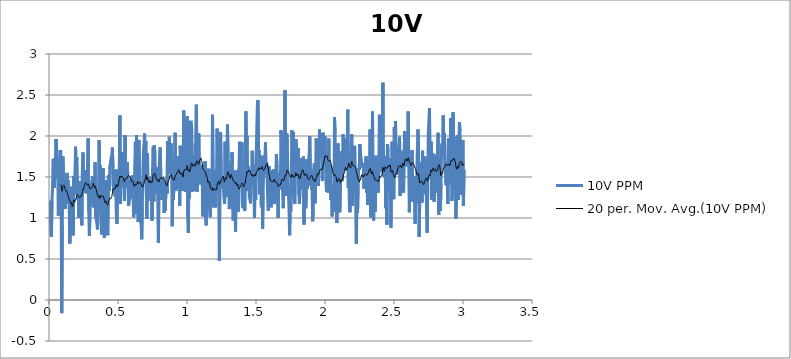
| Category | 10V PPM |
|---|---|
| 0.0048433325833333336 | 1.21 |
| 0.009013015527777779 | 1.17 |
| 0.013182420666666667 | 0.81 |
| 0.017351825805555558 | 0.77 |
| 0.021520675361111113 | 1.21 |
| 0.025689802694444444 | 1.36 |
| 0.029858652250000003 | 1.72 |
| 0.034027779611111114 | 1.64 |
| 0.03819690697222222 | 1.37 |
| 0.04236631211111111 | 1.73 |
| 0.046535161666666665 | 1.48 |
| 0.05070401122222222 | 1.96 |
| 0.054873416361111114 | 1.84 |
| 0.0590428215 | 1.82 |
| 0.06321167105555556 | 1.61 |
| 0.06738135399999999 | 1.03 |
| 0.07155020355555557 | 1.17 |
| 0.07571933088888888 | 1.18 |
| 0.07988845825 | 1.17 |
| 0.08405758558333333 | 1.83 |
| 0.08822671294444444 | 1.09 |
| 0.0923955625 | -0.16 |
| 0.09656468986111111 | 0.91 |
| 0.10073381719444445 | 1.75 |
| 0.10490322233333334 | 1.49 |
| 0.10907207188888889 | 1.35 |
| 0.11324092144444445 | 1.28 |
| 0.117409771 | 1.11 |
| 0.12158000952777778 | 1.1 |
| 0.1257491368888889 | 1.4 |
| 0.12991826422222222 | 1.55 |
| 0.13408711377777777 | 1.41 |
| 0.1382562411388889 | 1.46 |
| 0.14242509069444445 | 1.17 |
| 0.14659449583333334 | 1.23 |
| 0.1507633453888889 | 0.69 |
| 0.15493275052777777 | 0.87 |
| 0.15910187788888888 | 0.83 |
| 0.16327128302777777 | 1.38 |
| 0.16744041038888888 | 0.85 |
| 0.17160925994444445 | 1.19 |
| 0.17577838727777778 | 0.79 |
| 0.17994723683333333 | 1.51 |
| 0.18411636419444447 | 1.29 |
| 0.1882854915277778 | 1.53 |
| 0.19245517447222224 | 1.87 |
| 0.1966245796111111 | 1.55 |
| 0.2007937069722222 | 1.74 |
| 0.20496255652777778 | 1.43 |
| 0.20913223944444445 | 1.22 |
| 0.2133016446111111 | 1.41 |
| 0.21747077194444445 | 1 |
| 0.22163989930555553 | 1.45 |
| 0.22580902663888888 | 1.24 |
| 0.22998037633333335 | 1.36 |
| 0.2341497815 | 1.06 |
| 0.23831890883333331 | 0.91 |
| 0.24248803619444442 | 1.63 |
| 0.24665688575 | 1.8 |
| 0.2508257353055556 | 1.31 |
| 0.25499458486111115 | 1.44 |
| 0.25916399 | 1.58 |
| 0.26333422852777777 | 1.56 |
| 0.26750307808333335 | 1.51 |
| 0.2716724832222222 | 1.3 |
| 0.27584161058333334 | 1.57 |
| 0.2800115713888889 | 1.55 |
| 0.28418042083333334 | 1.97 |
| 0.2883498261111111 | 1.07 |
| 0.29251895333333333 | 0.78 |
| 0.296687525 | 1.06 |
| 0.30085693027777777 | 1.18 |
| 0.3050260575 | 1.3 |
| 0.309195185 | 1.44 |
| 0.31336403444444444 | 1.45 |
| 0.31753288416666664 | 1.51 |
| 0.32170228916666666 | 1.5 |
| 0.32587197222222225 | 1.13 |
| 0.33004109944444443 | 1.23 |
| 0.33421022694444447 | 1.68 |
| 0.33837935416666665 | 1.02 |
| 0.3425482038888889 | 1.02 |
| 0.3467173311111111 | 0.94 |
| 0.3508872919444444 | 0.86 |
| 0.3550561413888889 | 1.05 |
| 0.3592252686111111 | 1.34 |
| 0.36339439611111113 | 1.95 |
| 0.3675635233333333 | 1.19 |
| 0.37173237305555556 | 1.64 |
| 0.37590122249999997 | 1.07 |
| 0.3800700722222222 | 0.8 |
| 0.3842391994444444 | 1 |
| 0.3884080488888889 | 1.37 |
| 0.3925771763888889 | 1.61 |
| 0.39674797055555555 | 1.1 |
| 0.4009179311111111 | 0.76 |
| 0.4050867808333334 | 1 |
| 0.40925590805555556 | 1.46 |
| 0.4134258688888889 | 1.28 |
| 0.41759499611111106 | 1.05 |
| 0.4217641236111111 | 0.85 |
| 0.42593408416666667 | 0.79 |
| 0.43010348944444443 | 1.52 |
| 0.43427261666666667 | 1.5 |
| 0.43844174416666665 | 1.33 |
| 0.44261087138888894 | 1.64 |
| 0.4467797211111111 | 1.65 |
| 0.4509488483333334 | 1.74 |
| 0.45511825361111113 | 1.76 |
| 0.4592871030555556 | 1.86 |
| 0.46345623027777777 | 1.61 |
| 0.46762508 | 1.31 |
| 0.4717942072222222 | 1.3 |
| 0.4759633347222222 | 1.55 |
| 0.4801324619444445 | 1.26 |
| 0.4843015894444444 | 1.59 |
| 0.4884704388888889 | 1.05 |
| 0.4926406775 | 0.93 |
| 0.49680924916666663 | 1.38 |
| 0.5009805988888889 | 1.38 |
| 0.5051502819444444 | 1.58 |
| 0.5093210758333333 | 1.52 |
| 0.5134904811111111 | 2.25 |
| 0.5176596083333334 | 1.17 |
| 0.5218292913888889 | 1.63 |
| 0.5259998077777778 | 1.5 |
| 0.5301706019444444 | 1.8 |
| 0.5343419513888888 | 1.38 |
| 0.5385110788888888 | 1.63 |
| 0.5426804838888889 | 1.41 |
| 0.5468512780555556 | 1.21 |
| 0.5510229055555556 | 2.01 |
| 0.5551917552777778 | 1.37 |
| 0.5593608825 | 1.42 |
| 0.5635316766666667 | 1.51 |
| 0.5677024708333334 | 1.68 |
| 0.5718727091666667 | 1.45 |
| 0.5760421144444444 | 1.15 |
| 0.5802109638888889 | 1.19 |
| 0.584379813611111 | 1.23 |
| 0.5885486630555556 | 1.46 |
| 0.5927177905555556 | 1.24 |
| 0.5968880288888888 | 1.51 |
| 0.6010574341666667 | 1.35 |
| 0.6052273947222222 | 1.52 |
| 0.6093990222222222 | 1.28 |
| 0.6135695386111112 | 1.01 |
| 0.6177386661111112 | 1.14 |
| 0.6219080711111111 | 1.65 |
| 0.6260788652777778 | 1.93 |
| 0.6302479925 | 1.05 |
| 0.6344182311111111 | 2.01 |
| 0.6385898586111111 | 1.67 |
| 0.6427592636111111 | 1.88 |
| 0.6469283911111111 | 0.95 |
| 0.6510994630555555 | 1.95 |
| 0.6552694236111111 | 1.48 |
| 0.6594410511111111 | 1.16 |
| 0.6636099008333334 | 1.2 |
| 0.6677798613888889 | 0.92 |
| 0.6719495444444444 | 0.74 |
| 0.6761189494444444 | 1.16 |
| 0.6802886324999999 | 1.55 |
| 0.6844585933333334 | 1.82 |
| 0.6886279983333333 | 1.91 |
| 0.6927976813888889 | 2.03 |
| 0.6969665308333333 | 1.53 |
| 0.7011356583333334 | 1.94 |
| 0.7053042300000001 | 1.3 |
| 0.7094733572222222 | 0.99 |
| 0.7136424847222221 | 1.79 |
| 0.7178130011111111 | 1.21 |
| 0.7219821283333334 | 1.49 |
| 0.7261554225 | 1.5 |
| 0.7303267722222222 | 1.49 |
| 0.7344958997222222 | 1.49 |
| 0.7386650269444445 | 1.39 |
| 0.7428341544444444 | 1.46 |
| 0.7470032816666666 | 0.97 |
| 0.7511724091666666 | 1.61 |
| 0.7553432030555555 | 1.87 |
| 0.7595120527777778 | 1.2 |
| 0.7636809022222222 | 1.89 |
| 0.7678497519444444 | 1.74 |
| 0.7720199902777778 | 1.48 |
| 0.7761918955555556 | 1.3 |
| 0.7803615786111111 | 1.35 |
| 0.7845304280555556 | 1.51 |
| 0.7887001111111112 | 1.62 |
| 0.7928703497222223 | 0.7 |
| 0.7970408658333332 | 1.5 |
| 0.8012158269444444 | 1.75 |
| 0.8053852319444443 | 1.86 |
| 0.8095540816666666 | 1.58 |
| 0.8137232088888889 | 1.59 |
| 0.8178959477777777 | 1.22 |
| 0.8220659083333333 | 1.47 |
| 0.8262361469444444 | 1.36 |
| 0.8304055519444445 | 1.34 |
| 0.8345746794444445 | 1.06 |
| 0.8387435288888889 | 1.46 |
| 0.8429129341666667 | 1.09 |
| 0.8470828947222222 | 1.36 |
| 0.8512523 | 1.48 |
| 0.8554214272222223 | 1.3 |
| 0.8595905547222222 | 1.94 |
| 0.86376496 | 1.71 |
| 0.8679346430555556 | 1.8 |
| 0.872105715 | 1.99 |
| 0.8762767869444444 | 1.54 |
| 0.880445636388889 | 1.59 |
| 0.8846150416666666 | 1.91 |
| 0.8887841688888889 | 1.58 |
| 0.8929535741666667 | 0.9 |
| 0.8971238125 | 1.38 |
| 0.9012946066666667 | 1.22 |
| 0.9054634561111111 | 1.22 |
| 0.9096323058333333 | 1.64 |
| 0.9138017108333333 | 2.04 |
| 0.9179719494444444 | 1.33 |
| 0.9221424658333334 | 1.58 |
| 0.9263115930555555 | 1.56 |
| 0.9304809983333333 | 1.36 |
| 0.934650681111111 | 1.75 |
| 0.9388239755555556 | 1.71 |
| 0.9429936583333333 | 1.65 |
| 0.9471627858333332 | 1.15 |
| 0.9513344133333334 | 1.88 |
| 0.9555077074999999 | 1.66 |
| 0.9596910022222223 | 1.87 |
| 0.9638612408333334 | 1.45 |
| 0.9680303680555555 | 1.33 |
| 0.9722019955555556 | 1.37 |
| 0.9763708452777777 | 2.31 |
| 0.980542195 | 1.46 |
| 0.9847113222222222 | 1.52 |
| 0.9888807275 | 1.32 |
| 0.9930501325000001 | 1.47 |
| 0.9972189822222222 | 2.12 |
| 1.0013892205555555 | 2.24 |
| 1.0055602925 | 1.01 |
| 1.00972942 | 0.82 |
| 1.0138996583333333 | 1.66 |
| 1.0180693413888888 | 1.24 |
| 1.022238468611111 | 2.17 |
| 1.0264095405555556 | 2.16 |
| 1.0305783902777779 | 2.17 |
| 1.0347475175 | 2.08 |
| 1.0389169227777777 | 1.32 |
| 1.0430888280555555 | 1.38 |
| 1.0472590663888888 | 1.76 |
| 1.0514284716666666 | 1.33 |
| 1.0555981544444444 | 1.48 |
| 1.0597670041666667 | 1.91 |
| 1.0639361313888889 | 1.8 |
| 1.0681055366666667 | 2.38 |
| 1.072274663888889 | 1.32 |
| 1.0764449025 | 1.56 |
| 1.0806143075 | 1.46 |
| 1.0847831572222222 | 2.03 |
| 1.0889520066666667 | 1.65 |
| 1.0931300236111112 | 1.41 |
| 1.0973027622222222 | 1.57 |
| 1.1014727227777779 | 1.64 |
| 1.1056415725 | 1.62 |
| 1.1098112552777777 | 1.6 |
| 1.1139803827777777 | 1.02 |
| 1.1181517325 | 1.57 |
| 1.1223205819444444 | 1.24 |
| 1.1264899872222223 | 1.07 |
| 1.1306588366666666 | 1.69 |
| 1.134827963888889 | 1.02 |
| 1.1389976469444445 | 0.91 |
| 1.1431670522222224 | 1.47 |
| 1.1473359016666667 | 1.6 |
| 1.1515053066666665 | 1.23 |
| 1.1556741563888888 | 1.49 |
| 1.1598452283333334 | 1.6 |
| 1.1640151888888888 | 1.11 |
| 1.168184316388889 | 1.01 |
| 1.1723537213888888 | 1.36 |
| 1.1765222933333332 | 1.2 |
| 1.1806916983333333 | 1.3 |
| 1.1848613813888889 | 2.26 |
| 1.1890302308333334 | 1.46 |
| 1.193201302777778 | 1.13 |
| 1.1973709858333335 | 1.31 |
| 1.2015403908333333 | 1.58 |
| 1.2057092402777776 | 1.13 |
| 1.2098811458333332 | 1.17 |
| 1.2140594402777778 | 1.52 |
| 1.2182285675 | 2.09 |
| 1.2223982505555555 | 1.61 |
| 1.2265687669444443 | 1.57 |
| 1.2307381719444446 | 1.82 |
| 1.2349070216666669 | 0.48 |
| 1.2390767044444444 | 1.7 |
| 1.2432458319444444 | 2.05 |
| 1.2474169036111111 | 1.55 |
| 1.251588531111111 | 1.36 |
| 1.2557573808333333 | 1.48 |
| 1.259927897222222 | 1.41 |
| 1.2640978577777777 | 1.47 |
| 1.268266985277778 | 1.26 |
| 1.2724363902777778 | 1.17 |
| 1.2766069066666668 | 1.93 |
| 1.280775756111111 | 1.46 |
| 1.2849446058333334 | 1.26 |
| 1.289114566388889 | 1.72 |
| 1.293283416111111 | 2.14 |
| 1.2974522655555554 | 1.73 |
| 1.3016222263888888 | 1.65 |
| 1.3057916313888889 | 1.11 |
| 1.3099615922222223 | 1.17 |
| 1.3141329419444443 | 1.59 |
| 1.3183017913888888 | 1.38 |
| 1.3224706411111111 | 1.34 |
| 1.3266397683333333 | 1.8 |
| 1.3308091736111112 | 1.12 |
| 1.3349816344444445 | 0.97 |
| 1.339157151111111 | 1.2 |
| 1.3433271116666667 | 1.21 |
| 1.3474956833333331 | 1.58 |
| 1.3516659219444445 | 0.83 |
| 1.3558364383333332 | 1.48 |
| 1.3600091769444445 | 1.45 |
| 1.3641833047222223 | 1.15 |
| 1.3683524319444444 | 1.58 |
| 1.3725218372222223 | 1.08 |
| 1.3766906866666666 | 1.61 |
| 1.380859813888889 | 1.93 |
| 1.3850289413888888 | 1.87 |
| 1.3891986241666667 | 1.61 |
| 1.3933674738888888 | 1.42 |
| 1.3975374344444444 | 1.92 |
| 1.4017093399999998 | 1.15 |
| 1.4058790227777778 | 1.12 |
| 1.4100492613888889 | 1.32 |
| 1.4142178330555557 | 1.58 |
| 1.4183872383333334 | 1.09 |
| 1.4225563655555555 | 1.79 |
| 1.426726048611111 | 2.3 |
| 1.4308948980555556 | 1.9 |
| 1.4350643033333332 | 2 |
| 1.4392378752777777 | 1.33 |
| 1.4434086694444443 | 1.63 |
| 1.4475777966666667 | 1.48 |
| 1.4517469241666665 | 1.23 |
| 1.455916051388889 | 1.28 |
| 1.4600860122222221 | 1.18 |
| 1.4642548616666666 | 1.47 |
| 1.468423711388889 | 1.52 |
| 1.4725928386111111 | 1.82 |
| 1.4767625216666667 | 1.41 |
| 1.4809322044444444 | 1.46 |
| 1.485101609722222 | 1.57 |
| 1.4892704591666666 | 1 |
| 1.4934398644444444 | 1.65 |
| 1.497608713888889 | 1.22 |
| 1.5017781191666666 | 1.78 |
| 1.505947246388889 | 2.1 |
| 1.5101160958333333 | 2.4 |
| 1.5142855011111112 | 2.44 |
| 1.5184543505555554 | 1.8 |
| 1.5226232002777778 | 1.83 |
| 1.5267926052777776 | 1.29 |
| 1.5309617327777778 | 1.44 |
| 1.5351311377777779 | 1.46 |
| 1.5393002652777779 | 1.13 |
| 1.5434710591666667 | 1.76 |
| 1.5476401866666667 | 0.87 |
| 1.5518093138888889 | 1.3 |
| 1.5559787191666667 | 1.69 |
| 1.560147568611111 | 1.66 |
| 1.5643175294444445 | 1.7 |
| 1.5684866566666666 | 1.92 |
| 1.5726557841666666 | 1.54 |
| 1.5768251891666667 | 1.68 |
| 1.5810015391666667 | 1.48 |
| 1.5851706666666667 | 1.2 |
| 1.5893400716666666 | 1.09 |
| 1.593510310277778 | 1.58 |
| 1.5976799930555554 | 1.63 |
| 1.6018502316666667 | 1.21 |
| 1.6060201925000002 | 1.45 |
| 1.6101895975 | 1.13 |
| 1.6143584472222223 | 1.58 |
| 1.6185272966666666 | 1.29 |
| 1.6226964241666666 | 1.23 |
| 1.6268655513888888 | 1.59 |
| 1.6310346786111112 | 1.5 |
| 1.6352046394444444 | 1.17 |
| 1.6393743225000001 | 1.23 |
| 1.6435440052777777 | 1.51 |
| 1.6477136883333332 | 1.78 |
| 1.6518830933333333 | 1.62 |
| 1.6560527763888888 | 1.45 |
| 1.6602307930555555 | 1 |
| 1.6644001983333334 | 1.54 |
| 1.6685737702777779 | 1.37 |
| 1.6727428977777776 | 1.35 |
| 1.6769139694444446 | 1.47 |
| 1.6810830969444444 | 2.07 |
| 1.6852530577777778 | 1.88 |
| 1.6894227405555555 | 1.62 |
| 1.6935918680555555 | 1.28 |
| 1.6977607175 | 1.12 |
| 1.7019295669444445 | 1.46 |
| 1.7060989722222222 | 1.41 |
| 1.7102680994444444 | 2.56 |
| 1.7144372269444443 | 1.52 |
| 1.7186063541666665 | 1.27 |
| 1.722784648888889 | 2.03 |
| 1.7269548872222222 | 1.91 |
| 1.7311262369444445 | 1.54 |
| 1.7352953644444444 | 1.3 |
| 1.7394650472222222 | 1.09 |
| 1.7436352858333335 | 0.79 |
| 1.7478044130555557 | 1.12 |
| 1.7519738183333333 | 1.08 |
| 1.7561426677777778 | 1.49 |
| 1.7603131841666666 | 2.07 |
| 1.7644837005555556 | 1.63 |
| 1.7686528277777778 | 2.05 |
| 1.7728222330555556 | 1.3 |
| 1.7769916380555555 | 1.24 |
| 1.7811663213888889 | 1.17 |
| 1.7853351708333334 | 1.92 |
| 1.7895042983333331 | 1.96 |
| 1.7936731477777776 | 1.86 |
| 1.797843108611111 | 1.61 |
| 1.8020122358333333 | 1.56 |
| 1.8061846966666666 | 1.85 |
| 1.8103568797222223 | 1.29 |
| 1.8145257294444446 | 1.17 |
| 1.818694578888889 | 1.38 |
| 1.822864539722222 | 1.49 |
| 1.827035056111111 | 1.73 |
| 1.8312047388888888 | 1.35 |
| 1.835373866388889 | 1.49 |
| 1.839542993611111 | 1.64 |
| 1.843712398888889 | 1.75 |
| 1.8478809705555554 | 0.92 |
| 1.8520503755555557 | 1.66 |
| 1.8562200586111113 | 1.68 |
| 1.8603889080555556 | 1.12 |
| 1.8645580355555555 | 1.3 |
| 1.8687288297222222 | 1.72 |
| 1.8729004572222223 | 1.36 |
| 1.8770768072222221 | 1.46 |
| 1.8812464899999999 | 1.4 |
| 1.8854158952777778 | 1.77 |
| 1.8895850225000002 | 2 |
| 1.8937560944444443 | 1.53 |
| 1.8979257774999998 | 1.58 |
| 1.9020951825 | 1.35 |
| 1.90626431 | 1.51 |
| 1.9104339927777778 | 0.96 |
| 1.9146028425000001 | 1.09 |
| 1.918773358611111 | 1.6 |
| 1.9229422083333334 | 1.67 |
| 1.9271113355555556 | 1.18 |
| 1.931280185277778 | 1.36 |
| 1.9354490347222224 | 1.97 |
| 1.93962094 | 1.91 |
| 1.943795901111111 | 1.9 |
| 1.947966695 | 1.59 |
| 1.9521394338888889 | 1.39 |
| 1.95630995 | 1.6 |
| 1.9604790775 | 2.08 |
| 1.9646484825000001 | 1.73 |
| 1.968818721111111 | 1.84 |
| 1.972988126388889 | 1.95 |
| 1.9771569758333334 | 1.76 |
| 1.9813261030555553 | 1.45 |
| 1.9854952305555555 | 2.04 |
| 1.9896654691666666 | 2.04 |
| 1.9938348741666667 | 1.82 |
| 1.9980090019444443 | 2 |
| 2.0021781291666665 | 1.91 |
| 2.006356145833333 | 1.46 |
| 2.0105249955555555 | 1.32 |
| 2.0146955116666665 | 1.31 |
| 2.0188660280555557 | 1.49 |
| 2.0230384888888886 | 1.31 |
| 2.027207338611111 | 1.97 |
| 2.0313784105555555 | 1.42 |
| 2.035553649166667 | 1.41 |
| 2.0397224988888887 | 1.65 |
| 2.043891348333333 | 1.22 |
| 2.0480607536111113 | 1.4 |
| 2.052229880833333 | 1.02 |
| 2.0564015083333334 | 1.26 |
| 2.060575080277778 | 1.08 |
| 2.0647444855555555 | 1.2 |
| 2.068913335 | 2.23 |
| 2.073083573611111 | 2.03 |
| 2.0772527008333332 | 1.46 |
| 2.0814248841666667 | 1.76 |
| 2.085594011388889 | 0.94 |
| 2.0897639722222223 | 1.33 |
| 2.093933377222222 | 1.91 |
| 2.0981030602777775 | 1.31 |
| 2.1022721875 | 1.72 |
| 2.106441315 | 1.07 |
| 2.110619887222222 | 1.26 |
| 2.1147923480555555 | 1.62 |
| 2.118961197777778 | 1.81 |
| 2.1231306027777777 | 1.45 |
| 2.1273000080555553 | 1.57 |
| 2.1314710797222225 | 2.02 |
| 2.135640207222222 | 1.58 |
| 2.1398090566666665 | 1.72 |
| 2.1439804063888888 | 1.58 |
| 2.1481506450000003 | 1.97 |
| 2.1523206058333333 | 1.72 |
| 2.156490010833333 | 1.94 |
| 2.1606610827777777 | 1.66 |
| 2.16483021 | 2.32 |
| 2.1689987819444445 | 1.37 |
| 2.1731679091666667 | 1.81 |
| 2.177336758888889 | 1.11 |
| 2.1815133866666665 | 1.07 |
| 2.185683625 | 1.56 |
| 2.189852474722222 | 1.87 |
| 2.194023268611111 | 2.02 |
| 2.1981954519444447 | 1.15 |
| 2.202365134722222 | 1.32 |
| 2.2065345400000003 | 1.35 |
| 2.210703945 | 1.65 |
| 2.2148730725 | 1.88 |
| 2.219044144166667 | 1.34 |
| 2.2232146605555556 | 1.38 |
| 2.227383510277778 | 0.69 |
| 2.2315529152777778 | 1.52 |
| 2.2357234316666665 | 1.06 |
| 2.2399020038888886 | 1.4 |
| 2.244070853611111 | 1.61 |
| 2.2482416475 | 1.59 |
| 2.2524113305555558 | 1.9 |
| 2.2565832358333333 | 1.79 |
| 2.2607518075 | 1.74 |
| 2.2649206572222225 | 1.67 |
| 2.269090895833333 | 1.64 |
| 2.2732597452777776 | 1.65 |
| 2.2774288725000003 | 1.65 |
| 2.281597722222222 | 1.36 |
| 2.285766571666667 | 1.66 |
| 2.2899370880555554 | 1.55 |
| 2.2941064930555557 | 1.49 |
| 2.2982758983333333 | 1.75 |
| 2.302445303333333 | 1.31 |
| 2.3066166530555554 | 1.47 |
| 2.310786058333333 | 1.16 |
| 2.3149554633333334 | 1.6 |
| 2.3191243130555557 | 1.68 |
| 2.3232959405555555 | 1.36 |
| 2.32746479 | 2.08 |
| 2.331635306388889 | 1.01 |
| 2.3358063783333334 | 1.3 |
| 2.3399757833333332 | 1.63 |
| 2.344144910833333 | 2.3 |
| 2.3483137602777777 | 1.21 |
| 2.3524828877777777 | 0.97 |
| 2.356658126388889 | 1.5 |
| 2.3608278094444444 | 1.13 |
| 2.365000548055556 | 1.08 |
| 2.3691699533333335 | 1.76 |
| 2.3733454697222225 | 1.4 |
| 2.3775168194444447 | 1.41 |
| 2.3816859469444442 | 1.52 |
| 2.3858561852777775 | 1.31 |
| 2.3900258683333333 | 1.63 |
| 2.394197495833333 | 2.26 |
| 2.398366623055556 | 1.57 |
| 2.4025382505555557 | 1.6 |
| 2.4067076558333333 | 1.65 |
| 2.410877060833333 | 2.1 |
| 2.4150467438888885 | 1.57 |
| 2.419216149166667 | 2.65 |
| 2.4233863875000003 | 1.51 |
| 2.4275555150000003 | 1.58 |
| 2.4317243644444444 | 1.5 |
| 2.4358940474999997 | 1.75 |
| 2.4400628969444447 | 1.12 |
| 2.44423258 | 1.31 |
| 2.448401429444444 | 0.92 |
| 2.4525708347222226 | 1.9 |
| 2.4567396841666667 | 1.82 |
| 2.4609107561111108 | 1.45 |
| 2.4650798833333334 | 1.31 |
| 2.4692487330555553 | 1.73 |
| 2.473418415833333 | 1.42 |
| 2.4775894877777778 | 0.88 |
| 2.481758615 | 1.42 |
| 2.4859277425000004 | 1.93 |
| 2.4900965919444444 | 1.65 |
| 2.4942654416666663 | 1.34 |
| 2.4984342911111113 | 1.23 |
| 2.502603418611111 | 2.11 |
| 2.5067725458333334 | 1.61 |
| 2.5109413955555557 | 2.18 |
| 2.515110245 | 1.53 |
| 2.5192790944444443 | 1.83 |
| 2.523448499722222 | 1.87 |
| 2.527617349166667 | 1.83 |
| 2.531786476666667 | 1.55 |
| 2.535957270833333 | 1.88 |
| 2.540126120277778 | 1.99 |
| 2.544298858888889 | 1.27 |
| 2.548467708611111 | 1.53 |
| 2.5526368358333333 | 1.34 |
| 2.556807352222222 | 1.32 |
| 2.5609764794444447 | 1.61 |
| 2.5651456069444447 | 1.82 |
| 2.5693150119444446 | 1.31 |
| 2.573493862222222 | 1.82 |
| 2.5776643783333335 | 2.06 |
| 2.5818332280555554 | 1.77 |
| 2.586002355277778 | 1.97 |
| 2.5901720383333333 | 1.93 |
| 2.5943417211111113 | 1.63 |
| 2.598510848611111 | 1.88 |
| 2.6026799758333334 | 2.3 |
| 2.6068491033333334 | 1.65 |
| 2.6110182305555556 | 1.07 |
| 2.6151890247222225 | 1.38 |
| 2.6193598188888885 | 1.4 |
| 2.623529779444444 | 1.75 |
| 2.6276989069444445 | 1.69 |
| 2.6318683119444444 | 1.83 |
| 2.636047995555556 | 1.2 |
| 2.6402182341666665 | 1.26 |
| 2.644387361388889 | 1.38 |
| 2.648556488888889 | 1.3 |
| 2.652727838611111 | 0.93 |
| 2.6568975213888892 | 1.51 |
| 2.6610683155555557 | 1.4 |
| 2.665237165 | 1.18 |
| 2.6694082369444443 | 1.82 |
| 2.6735784755555554 | 2.08 |
| 2.6777481583333334 | 1.82 |
| 2.681917563611111 | 0.77 |
| 2.686088357777778 | 1.18 |
| 2.690257485 | 1.68 |
| 2.694427723611111 | 1.35 |
| 2.698597684166667 | 1.4 |
| 2.7027670894444444 | 1.19 |
| 2.7069373280555555 | 1.82 |
| 2.711114233611111 | 1.29 |
| 2.7152833608333333 | 1.55 |
| 2.7194572108333332 | 1.68 |
| 2.7236280047222223 | 1.75 |
| 2.727799632222222 | 1.64 |
| 2.731968204166667 | 1.59 |
| 2.7361401094444444 | 1.07 |
| 2.7403095144444443 | 0.82 |
| 2.744478364166667 | 1.4 |
| 2.7486480469444445 | 2.04 |
| 2.752821063611111 | 2.18 |
| 2.7569899130555555 | 2.34 |
| 2.7611618183333335 | 1.54 |
| 2.7653320569444446 | 1.48 |
| 2.769501739722222 | 1.93 |
| 2.773671145 | 1.22 |
| 2.7778399944444447 | 1.75 |
| 2.7820088444444444 | 1.79 |
| 2.786177972222222 | 1.32 |
| 2.7903468222222223 | 1.2 |
| 2.794516780555556 | 1.34 |
| 2.7986886861111113 | 1.77 |
| 2.802858925 | 1.66 |
| 2.8070358305555554 | 1.31 |
| 2.811204958333333 | 1.65 |
| 2.815374086111111 | 1.82 |
| 2.8195432138888887 | 2.04 |
| 2.8237140083333334 | 1.04 |
| 2.8278839666666666 | 1.56 |
| 2.832053372222222 | 1.41 |
| 2.8362233333333333 | 1.09 |
| 2.840392461111111 | 1.42 |
| 2.844561311111111 | 1.87 |
| 2.848730438888889 | 1.91 |
| 2.852900677777778 | 1.75 |
| 2.857069802777778 | 2.25 |
| 2.861238652777778 | 1.91 |
| 2.8654080583333337 | 2.03 |
| 2.8695777416666663 | 1.6 |
| 2.8737640916666667 | 1.64 |
| 2.877933775 | 1.4 |
| 2.8821031805555553 | 1.68 |
| 2.886272586111111 | 1.59 |
| 2.890441713888889 | 1.17 |
| 2.894612227777778 | 1.97 |
| 2.8987833 | 1.7 |
| 2.90295215 | 1.71 |
| 2.907125444444444 | 1.41 |
| 2.9112942944444447 | 2.22 |
| 2.915464811111111 | 1.69 |
| 2.9196369944444447 | 1.21 |
| 2.923807511111111 | 1.32 |
| 2.927976358333333 | 2.29 |
| 2.9321454861111107 | 1.73 |
| 2.936315725 | 1.99 |
| 2.9404851305555555 | 1.77 |
| 2.9446570361111113 | 1.48 |
| 2.9488269972222225 | 0.99 |
| 2.9529983472222225 | 0.99 |
| 2.957167752777778 | 1.7 |
| 2.961343266666667 | 2.01 |
| 2.9655121166666665 | 1.22 |
| 2.9696818 | 1.87 |
| 2.973852872222222 | 2.17 |
| 2.9780236666666666 | 2.07 |
| 2.9821944611111113 | 1.8 |
| 2.986364977777778 | 1.88 |
| 2.990539105555556 | 1.28 |
| 2.994708511111111 | 1.33 |
| 2.998877913888889 | 1.95 |
| 3.0030473194444443 | 1.15 |
| 3.0072172805555555 | 1.59 |